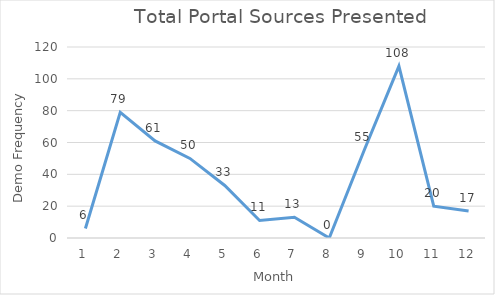
| Category | Total Portal Sources Presented |
|---|---|
| 0 | 6 |
| 1 | 79 |
| 2 | 61 |
| 3 | 50 |
| 4 | 33 |
| 5 | 11 |
| 6 | 13 |
| 7 | 0 |
| 8 | 55 |
| 9 | 108 |
| 10 | 20 |
| 11 | 17 |